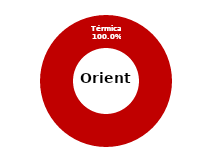
| Category | Oriente |
|---|---|
| Eólica | 0 |
| Hidráulica | 0 |
| Solar | 0 |
| Térmica | 35.401 |